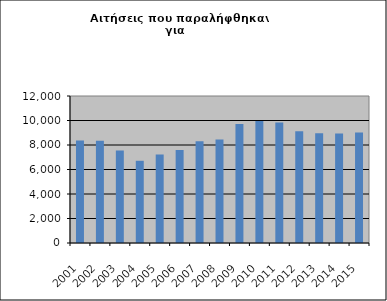
| Category | Series 0 |
|---|---|
| 2001.0 | 8373 |
| 2002.0 | 8343 |
| 2003.0 | 7552 |
| 2004.0 | 6712 |
| 2005.0 | 7219 |
| 2006.0 | 7583 |
| 2007.0 | 8298 |
| 2008.0 | 8442 |
| 2009.0 | 9709 |
| 2010.0 | 9961 |
| 2011.0 | 9830 |
| 2012.0 | 9120 |
| 2013.0 | 8963 |
| 2014.0 | 8939 |
| 2015.0 | 9015 |